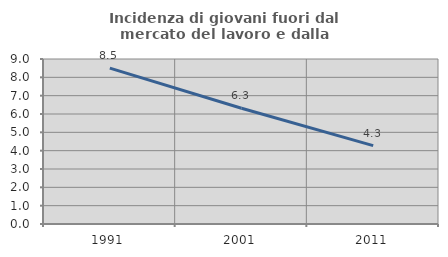
| Category | Incidenza di giovani fuori dal mercato del lavoro e dalla formazione  |
|---|---|
| 1991.0 | 8.503 |
| 2001.0 | 6.316 |
| 2011.0 | 4.278 |